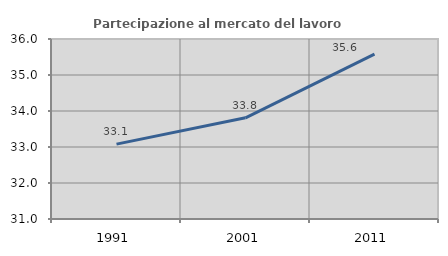
| Category | Partecipazione al mercato del lavoro  femminile |
|---|---|
| 1991.0 | 33.079 |
| 2001.0 | 33.811 |
| 2011.0 | 35.578 |